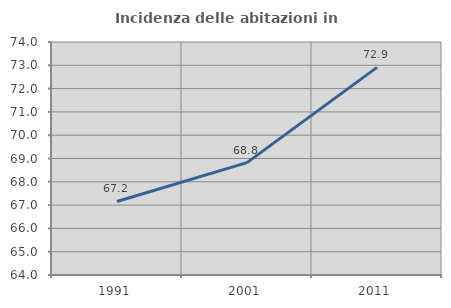
| Category | Incidenza delle abitazioni in proprietà  |
|---|---|
| 1991.0 | 67.155 |
| 2001.0 | 68.821 |
| 2011.0 | 72.912 |